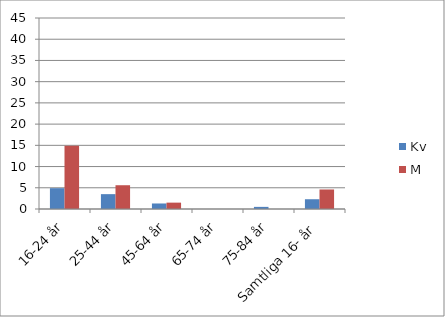
| Category | Kv | M |
|---|---|---|
| 16-24 år | 4.9 | 14.9 |
| 25-44 år | 3.5 | 5.6 |
| 45-64 år | 1.3 | 1.5 |
| 65-74 år | 0 | 0 |
| 75-84 år | 0.5 | 0 |
| Samtliga 16- år | 2.3 | 4.6 |